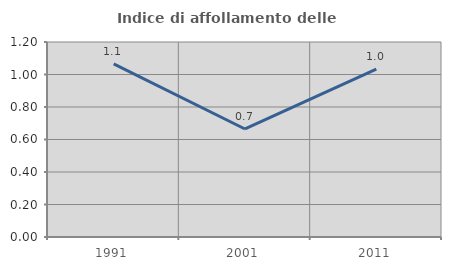
| Category | Indice di affollamento delle abitazioni  |
|---|---|
| 1991.0 | 1.065 |
| 2001.0 | 0.665 |
| 2011.0 | 1.034 |